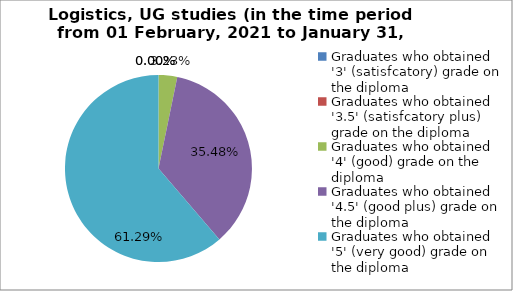
| Category | Series 0 |
|---|---|
| Graduates who obtained '3' (satisfcatory) grade on the diploma  | 0 |
| Graduates who obtained '3.5' (satisfcatory plus) grade on the diploma  | 0 |
| Graduates who obtained '4' (good) grade on the diploma  | 3.226 |
| Graduates who obtained '4.5' (good plus) grade on the diploma  | 35.484 |
| Graduates who obtained '5' (very good) grade on the diploma  | 61.29 |